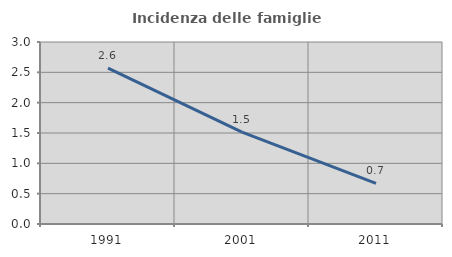
| Category | Incidenza delle famiglie numerose |
|---|---|
| 1991.0 | 2.57 |
| 2001.0 | 1.516 |
| 2011.0 | 0.668 |